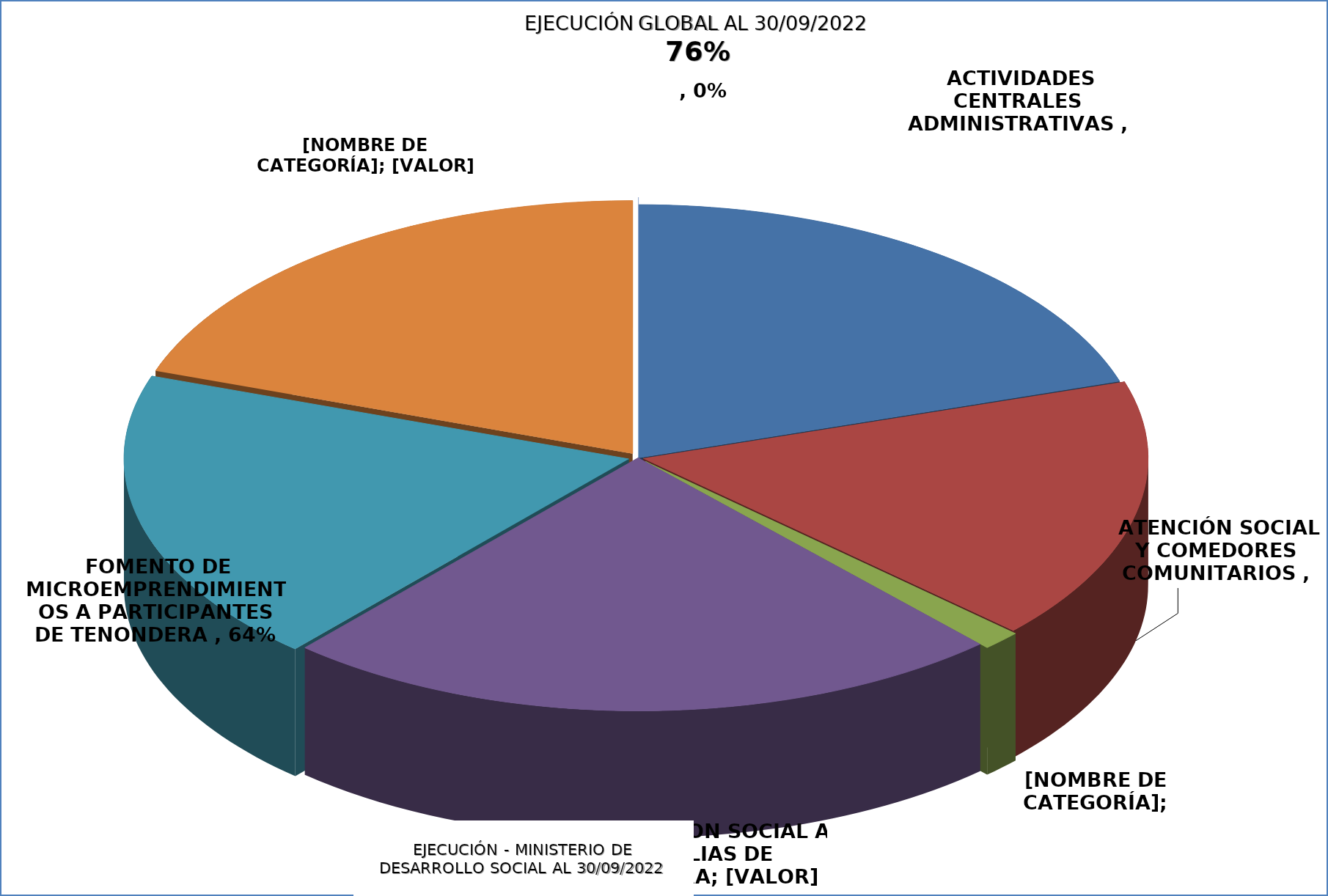
| Category | EJECUCIÓN - MINISTERIO DE DESARROLLO SOCIAL |
|---|---|
| ACTIVIDADES CENTRALES ADMINISTRATIVAS | 0.68 |
| ATENCIÓN SOCIAL Y COMEDORES COMUNITARIOS | 0.568 |
| ASISTENCIA A PESCADORES POR VEDA PESQUERA | 0.043 |
| PROTECCIÓN SOCIAL A FAMILIAS DE TEKOPORA  | 0.788 |
| FOMENTO DE MICROEMPRENDIMIENTOS A PARTICIPANTES DE TENONDERA | 0.637 |
| REGULARIZACIÓN DE TERRITORIOS SOCIALES, TEKOHA | 0.666 |